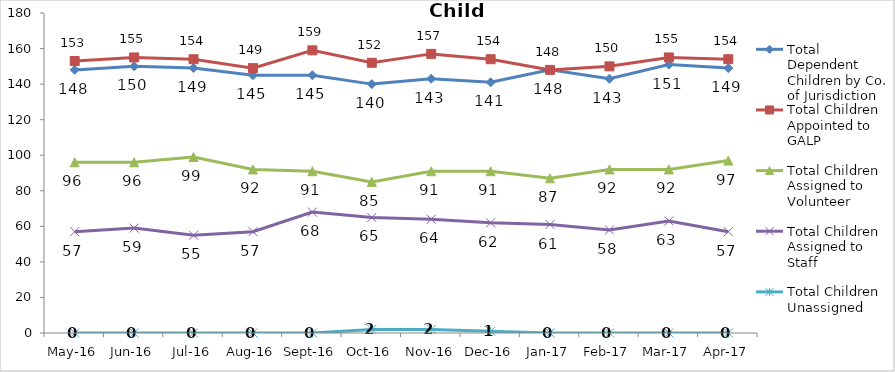
| Category | Total Dependent Children by Co. of Jurisdiction | Total Children Appointed to GALP | Total Children Assigned to Volunteer | Total Children Assigned to Staff | Total Children Unassigned |
|---|---|---|---|---|---|
| May-16 | 148 | 153 | 96 | 57 | 0 |
| Jun-16 | 150 | 155 | 96 | 59 | 0 |
| Jul-16 | 149 | 154 | 99 | 55 | 0 |
| Aug-16 | 145 | 149 | 92 | 57 | 0 |
| Sep-16 | 145 | 159 | 91 | 68 | 0 |
| Oct-16 | 140 | 152 | 85 | 65 | 2 |
| Nov-16 | 143 | 157 | 91 | 64 | 2 |
| Dec-16 | 141 | 154 | 91 | 62 | 1 |
| Jan-17 | 148 | 148 | 87 | 61 | 0 |
| Feb-17 | 143 | 150 | 92 | 58 | 0 |
| Mar-17 | 151 | 155 | 92 | 63 | 0 |
| Apr-17 | 149 | 154 | 97 | 57 | 0 |